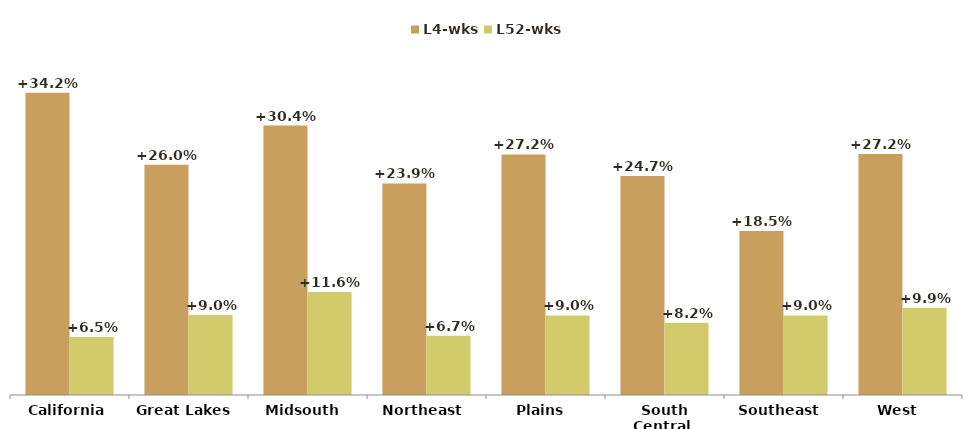
| Category | L4-wks | L52-wks |
|---|---|---|
| California | 0.342 | 0.065 |
| Great Lakes  | 0.26 | 0.09 |
| Midsouth  | 0.304 | 0.116 |
| Northeast  | 0.239 | 0.067 |
| Plains  | 0.272 | 0.09 |
| South Central  | 0.247 | 0.082 |
| Southeast  | 0.185 | 0.09 |
| West  | 0.272 | 0.099 |